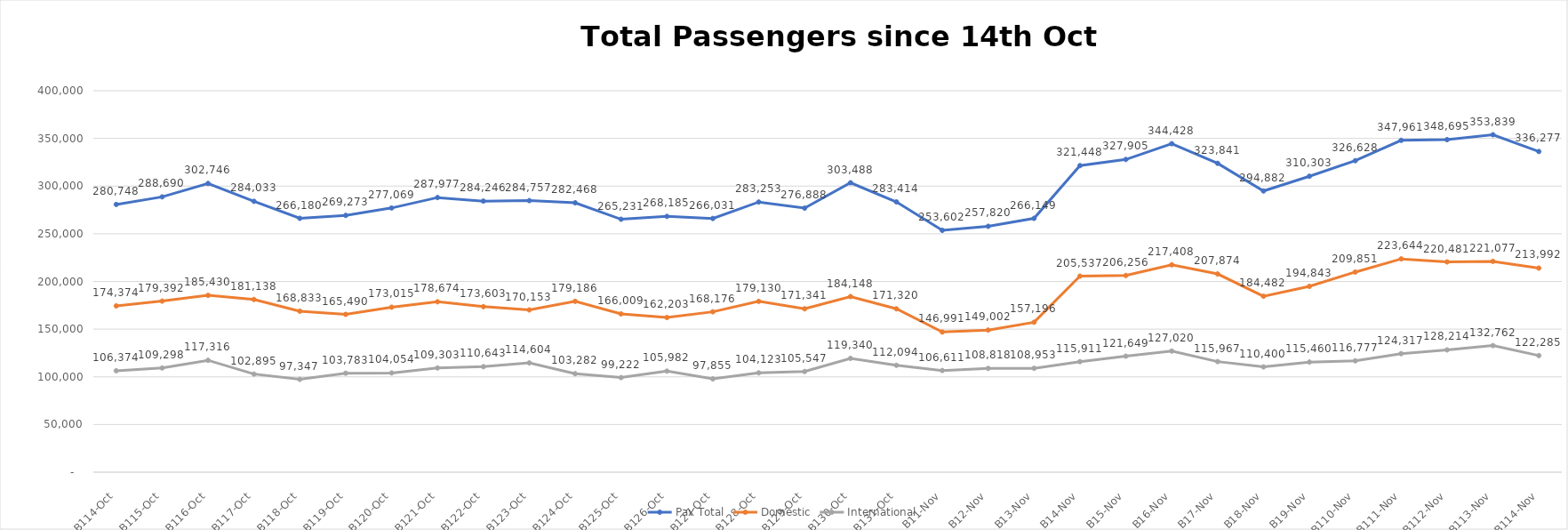
| Category | Pax Total |  Domestic  |  International  |
|---|---|---|---|
| 2022-10-14 | 280748 | 174374 | 106374 |
| 2022-10-15 | 288690 | 179392 | 109298 |
| 2022-10-16 | 302746 | 185430 | 117316 |
| 2022-10-17 | 284033 | 181138 | 102895 |
| 2022-10-18 | 266180 | 168833 | 97347 |
| 2022-10-19 | 269273 | 165490 | 103783 |
| 2022-10-20 | 277069 | 173015 | 104054 |
| 2022-10-21 | 287977 | 178674 | 109303 |
| 2022-10-22 | 284246 | 173603 | 110643 |
| 2022-10-23 | 284757 | 170153 | 114604 |
| 2022-10-24 | 282468 | 179186 | 103282 |
| 2022-10-25 | 265231 | 166009 | 99222 |
| 2022-10-26 | 268185 | 162203 | 105982 |
| 2022-10-27 | 266031 | 168176 | 97855 |
| 2022-10-28 | 283253 | 179130 | 104123 |
| 2022-10-29 | 276888 | 171341 | 105547 |
| 2022-10-30 | 303488 | 184148 | 119340 |
| 2022-10-31 | 283414 | 171320 | 112094 |
| 2022-11-01 | 253602 | 146991 | 106611 |
| 2022-11-02 | 257820 | 149002 | 108818 |
| 2022-11-03 | 266149 | 157196 | 108953 |
| 2022-11-04 | 321448 | 205537 | 115911 |
| 2022-11-05 | 327905 | 206256 | 121649 |
| 2022-11-06 | 344428 | 217408 | 127020 |
| 2022-11-07 | 323841 | 207874 | 115967 |
| 2022-11-08 | 294882 | 184482 | 110400 |
| 2022-11-09 | 310303 | 194843 | 115460 |
| 2022-11-10 | 326628 | 209851 | 116777 |
| 2022-11-11 | 347961 | 223644 | 124317 |
| 2022-11-12 | 348695 | 220481 | 128214 |
| 2022-11-13 | 353839 | 221077 | 132762 |
| 2022-11-14 | 336277 | 213992 | 122285 |